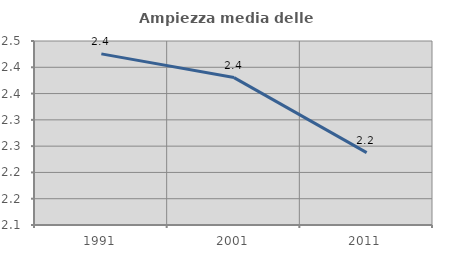
| Category | Ampiezza media delle famiglie |
|---|---|
| 1991.0 | 2.426 |
| 2001.0 | 2.38 |
| 2011.0 | 2.238 |